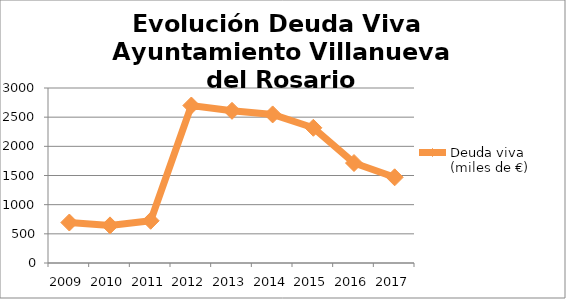
| Category | Deuda viva (miles de €) |
|---|---|
| 2009.0 | 694 |
| 2010.0 | 645 |
| 2011.0 | 724 |
| 2012.0 | 2700 |
| 2013.0 | 2609 |
| 2014.0 | 2547 |
| 2015.0 | 2318 |
| 2016.0 | 1714 |
| 2017.0 | 1469 |